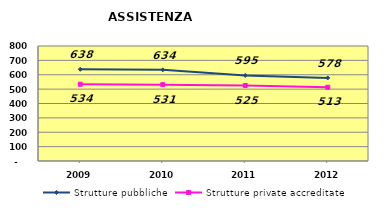
| Category | Strutture pubbliche | Strutture private accreditate |
|---|---|---|
| 2009.0 | 638 | 534 |
| 2010.0 | 634 | 531 |
| 2011.0 | 595 | 525 |
| 2012.0 | 578 | 513 |